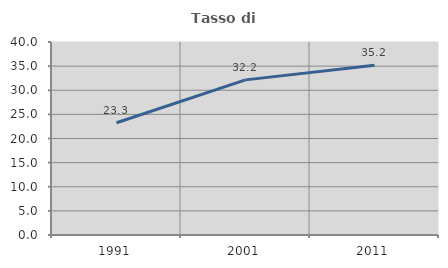
| Category | Tasso di occupazione   |
|---|---|
| 1991.0 | 23.262 |
| 2001.0 | 32.151 |
| 2011.0 | 35.197 |